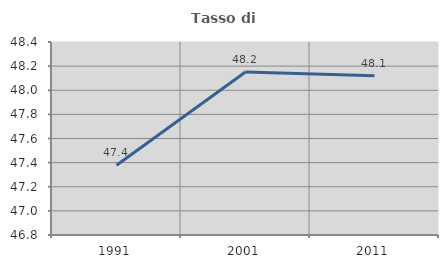
| Category | Tasso di occupazione   |
|---|---|
| 1991.0 | 47.378 |
| 2001.0 | 48.151 |
| 2011.0 | 48.121 |